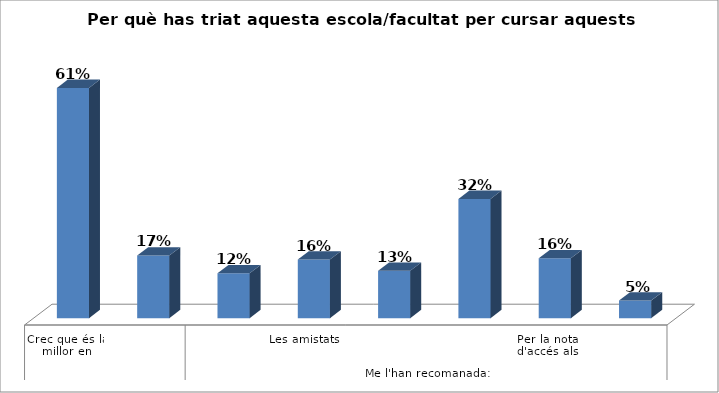
| Category | Series 0 |
|---|---|
| 0 | 0.61 |
| 1 | 0.166 |
| 2 | 0.119 |
| 3 | 0.155 |
| 4 | 0.126 |
| 5 | 0.316 |
| 6 | 0.159 |
| 7 | 0.046 |